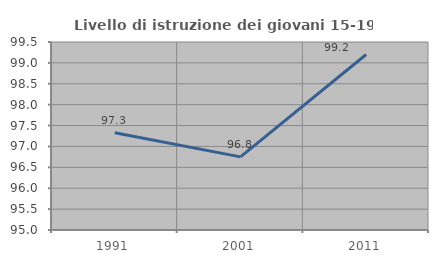
| Category | Livello di istruzione dei giovani 15-19 anni |
|---|---|
| 1991.0 | 97.33 |
| 2001.0 | 96.751 |
| 2011.0 | 99.2 |